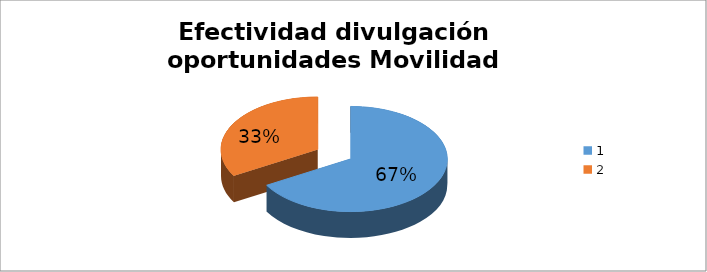
| Category | Porcentaje |
|---|---|
| 0 | 0.667 |
| 1 | 0.333 |